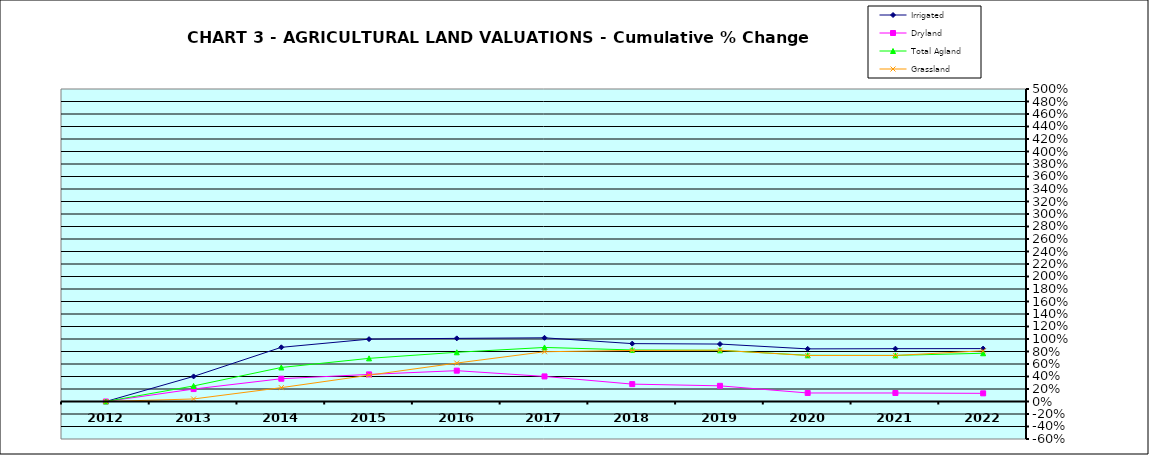
| Category | Irrigated | Dryland | Total Agland | Grassland |
|---|---|---|---|---|
| 2012.0 | 0 | 0 | 0 | 0 |
| 2013.0 | 0.401 | 0.199 | 0.249 | 0.041 |
| 2014.0 | 0.867 | 0.364 | 0.544 | 0.222 |
| 2015.0 | 0.998 | 0.434 | 0.69 | 0.421 |
| 2016.0 | 1.01 | 0.493 | 0.787 | 0.615 |
| 2017.0 | 1.019 | 0.401 | 0.865 | 0.796 |
| 2018.0 | 0.926 | 0.278 | 0.825 | 0.817 |
| 2019.0 | 0.919 | 0.251 | 0.819 | 0.821 |
| 2020.0 | 0.842 | 0.136 | 0.739 | 0.736 |
| 2021.0 | 0.845 | 0.136 | 0.738 | 0.736 |
| 2022.0 | 0.847 | 0.131 | 0.772 | 0.812 |